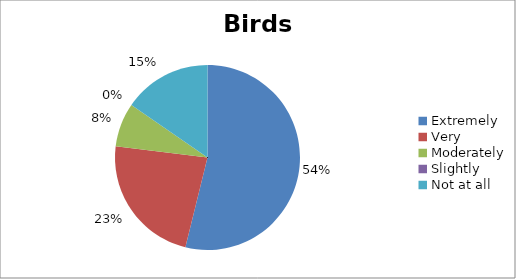
| Category | Birds |
|---|---|
| Extremely | 7 |
| Very | 3 |
| Moderately | 1 |
| Slightly | 0 |
| Not at all | 2 |